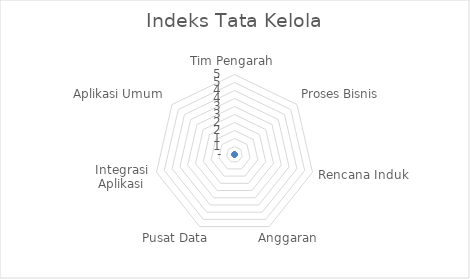
| Category | Indeks |
|---|---|
| Tim Pengarah | 0 |
| Proses Bisnis | 0 |
| Rencana Induk | 0 |
| Anggaran | 0 |
| Pusat Data | 0 |
| Integrasi Aplikasi | 0 |
| Aplikasi Umum | 0 |